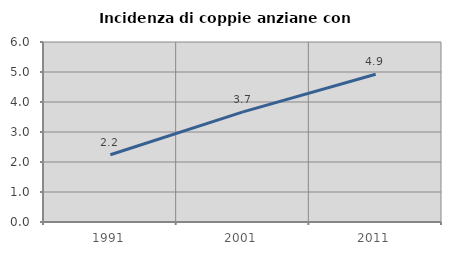
| Category | Incidenza di coppie anziane con figli |
|---|---|
| 1991.0 | 2.243 |
| 2001.0 | 3.671 |
| 2011.0 | 4.924 |